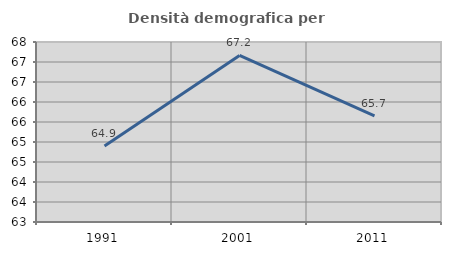
| Category | Densità demografica |
|---|---|
| 1991.0 | 64.899 |
| 2001.0 | 67.163 |
| 2011.0 | 65.654 |